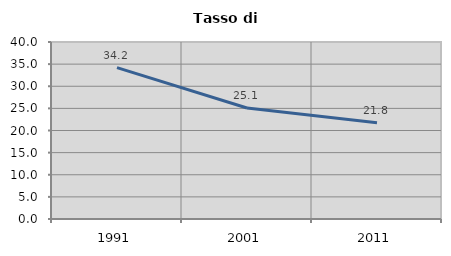
| Category | Tasso di disoccupazione   |
|---|---|
| 1991.0 | 34.2 |
| 2001.0 | 25.075 |
| 2011.0 | 21.753 |